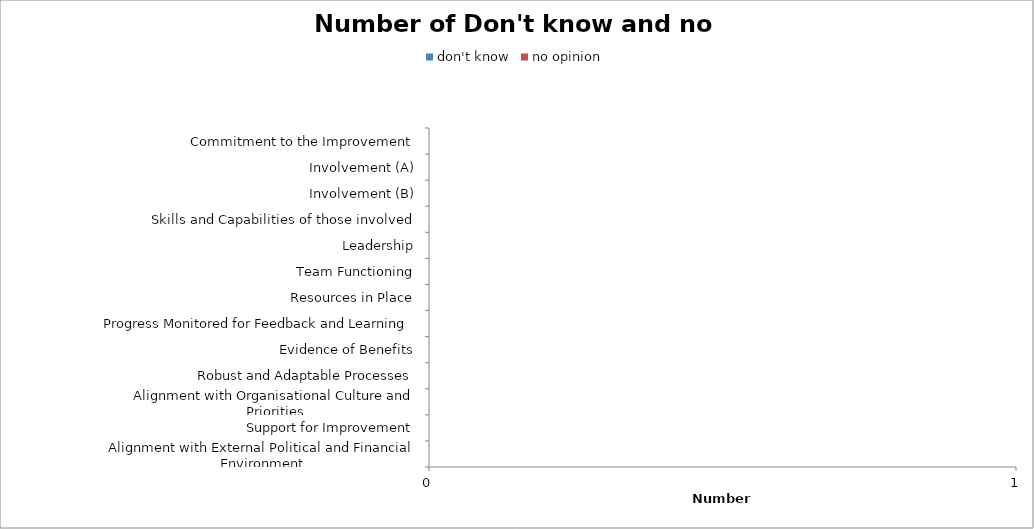
| Category | don't know | no opinion |
|---|---|---|
| Commitment to the Improvement | 0 | 0 |
| Involvement (A) | 0 | 0 |
| Involvement (B) | 0 | 0 |
| Skills and Capabilities of those involved | 0 | 0 |
| Leadership | 0 | 0 |
| Team Functioning | 0 | 0 |
| Resources in Place | 0 | 0 |
| Progress Monitored for Feedback and Learning | 0 | 0 |
| Evidence of Benefits | 0 | 0 |
| Robust and Adaptable Processes | 0 | 0 |
| Alignment with Organisational Culture and Priorities | 0 | 0 |
| Support for Improvement | 0 | 0 |
| Alignment with External Political and Financial Environment | 0 | 0 |